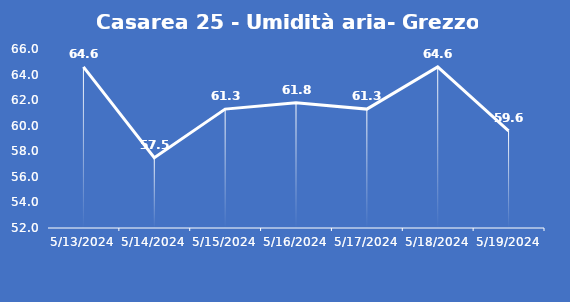
| Category | Casarea 25 - Umidità aria- Grezzo (%) |
|---|---|
| 5/13/24 | 64.6 |
| 5/14/24 | 57.5 |
| 5/15/24 | 61.3 |
| 5/16/24 | 61.8 |
| 5/17/24 | 61.3 |
| 5/18/24 | 64.6 |
| 5/19/24 | 59.6 |